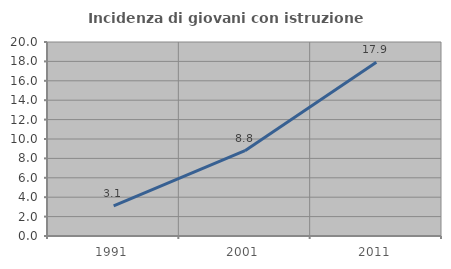
| Category | Incidenza di giovani con istruzione universitaria |
|---|---|
| 1991.0 | 3.097 |
| 2001.0 | 8.8 |
| 2011.0 | 17.925 |